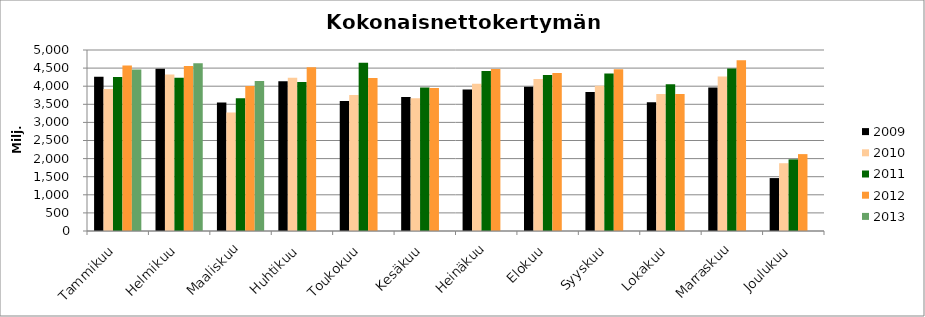
| Category | 2009 | 2010 | 2011 | 2012 | 2013 |
|---|---|---|---|---|---|
| Tammikuu | 4262.104 | 3920.596 | 4254.457 | 4574.273 | 4458.574 |
| Helmikuu | 4482.61 | 4324.273 | 4236.531 | 4556.683 | 4631.184 |
| Maaliskuu | 3551.222 | 3273.1 | 3667.911 | 4003.705 | 4141.995 |
| Huhtikuu | 4137.11 | 4235.283 | 4118.677 | 4521.853 | 0 |
| Toukokuu | 3589.232 | 3758.246 | 4645.002 | 4229.781 | 0 |
| Kesäkuu | 3701.617 | 3667.134 | 3966.073 | 3950.962 | 0 |
| Heinäkuu | 3908.058 | 4070.751 | 4417.867 | 4473.488 | 0 |
| Elokuu | 3983.999 | 4202.024 | 4310.334 | 4361.243 | 0 |
| Syyskuu | 3843.197 | 4009.059 | 4353.55 | 4465.954 | 0 |
| Lokakuu | 3558.554 | 3781.91 | 4052.329 | 3783.435 | 0 |
| Marraskuu | 3964.456 | 4269.91 | 4491.275 | 4716.744 | 0 |
| Joulukuu | 1461.632 | 1872.231 | 1978.993 | 2124.114 | 0 |